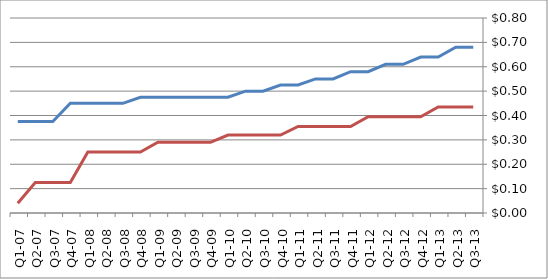
| Category | Telus | Rogers |
|---|---|---|
| Q3-13 | 0.68 | 0.435 |
| Q2-13 | 0.68 | 0.435 |
| Q1-13 | 0.64 | 0.435 |
| Q4-12 | 0.64 | 0.395 |
| Q3-12 | 0.61 | 0.395 |
| Q2-12 | 0.61 | 0.395 |
| Q1-12 | 0.58 | 0.395 |
| Q4-11 | 0.58 | 0.355 |
| Q3-11 | 0.55 | 0.355 |
| Q2-11 | 0.55 | 0.355 |
| Q1-11 | 0.525 | 0.355 |
| Q4-10 | 0.525 | 0.32 |
| Q3-10 | 0.5 | 0.32 |
| Q2-10 | 0.5 | 0.32 |
| Q1-10 | 0.475 | 0.32 |
| Q4-09 | 0.475 | 0.29 |
| Q3-09 | 0.475 | 0.29 |
| Q2-09 | 0.475 | 0.29 |
| Q1-09 | 0.475 | 0.29 |
| Q4-08 | 0.475 | 0.25 |
| Q3-08 | 0.45 | 0.25 |
| Q2-08 | 0.45 | 0.25 |
| Q1-08 | 0.45 | 0.25 |
| Q4-07 | 0.45 | 0.125 |
| Q3-07 | 0.375 | 0.125 |
| Q2-07 | 0.375 | 0.125 |
| Q1-07 | 0.375 | 0.04 |